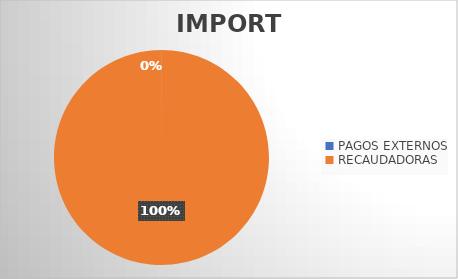
| Category | IMPORTE |
|---|---|
| PAGOS EXTERNOS | 261927.34 |
| RECAUDADORAS | 1580456995.15 |